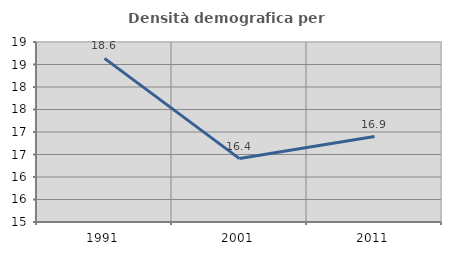
| Category | Densità demografica |
|---|---|
| 1991.0 | 18.636 |
| 2001.0 | 16.409 |
| 2011.0 | 16.899 |